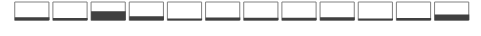
| Category | Dummy100Pct | Series 0 |
|---|---|---|
| 0 |  | 0.15 |
| 1 |  | 0.108 |
| 2 |  | 0.483 |
| 3 |  | 0.208 |
| 4 |  | 0.084 |
| 5 |  | 0.139 |
| 6 |  | 0.123 |
| 7 |  | 0.123 |
| 8 |  | 0.146 |
| 9 |  | 0.09 |
| 10 |  | 0.117 |
| 11 |  | 0.309 |